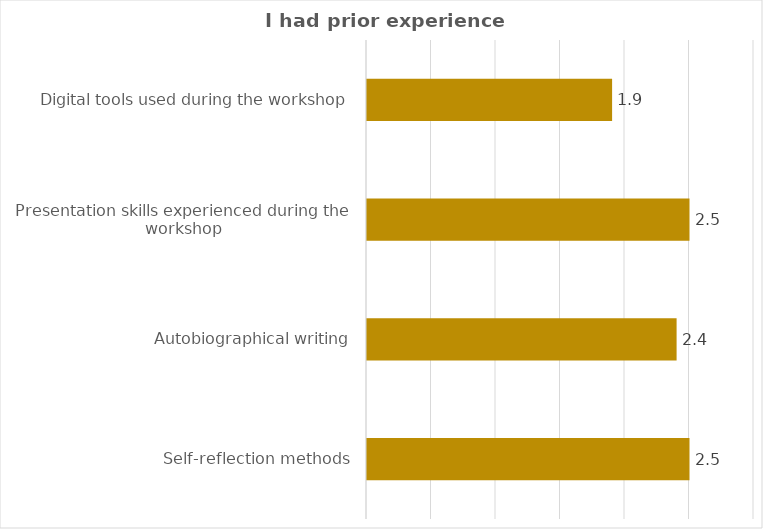
| Category | Series 0 |
|---|---|
| Self-reflection methods | 2.5 |
| Autobiographical writing | 2.4 |
| Presentation skills experienced during the workshop | 2.5 |
|  Digital tools used during the workshop | 1.9 |